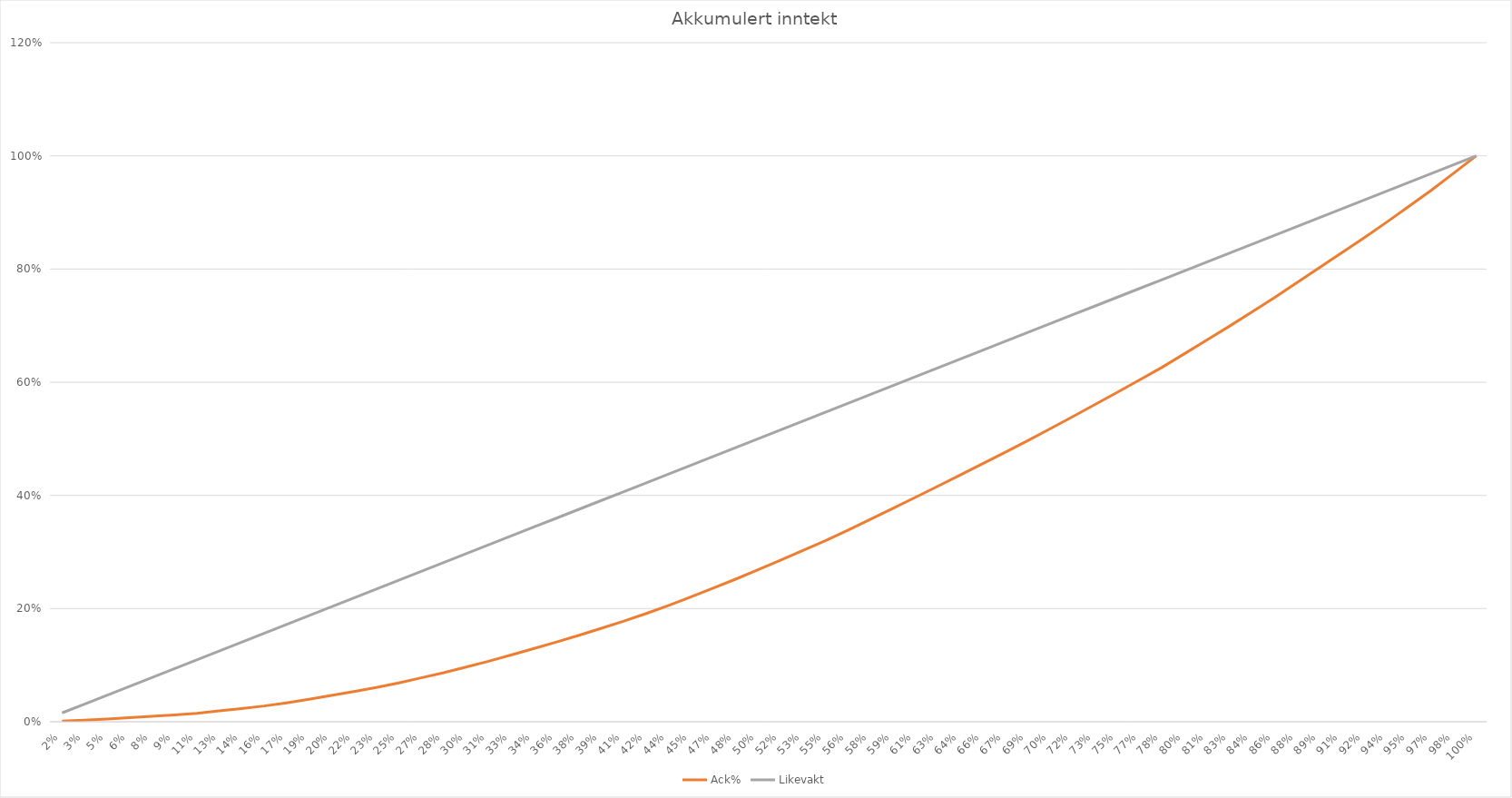
| Category | Ack% | Likevakt |
|---|---|---|
| 0.015625 | 0.001 | 0.016 |
| 0.03125 | 0.003 | 0.031 |
| 0.046875 | 0.005 | 0.047 |
| 0.0625 | 0.007 | 0.062 |
| 0.078125 | 0.01 | 0.078 |
| 0.09375 | 0.012 | 0.094 |
| 0.109375 | 0.015 | 0.109 |
| 0.125 | 0.019 | 0.125 |
| 0.140625 | 0.023 | 0.141 |
| 0.15625 | 0.028 | 0.156 |
| 0.171875 | 0.033 | 0.172 |
| 0.1875 | 0.04 | 0.188 |
| 0.203125 | 0.046 | 0.203 |
| 0.21875 | 0.053 | 0.219 |
| 0.234375 | 0.06 | 0.234 |
| 0.25 | 0.069 | 0.25 |
| 0.265625 | 0.078 | 0.266 |
| 0.28125 | 0.087 | 0.281 |
| 0.296875 | 0.097 | 0.297 |
| 0.3125 | 0.107 | 0.312 |
| 0.328125 | 0.118 | 0.328 |
| 0.34375 | 0.129 | 0.344 |
| 0.359375 | 0.141 | 0.359 |
| 0.375 | 0.153 | 0.375 |
| 0.390625 | 0.165 | 0.391 |
| 0.40625 | 0.177 | 0.406 |
| 0.421875 | 0.191 | 0.422 |
| 0.4375 | 0.205 | 0.438 |
| 0.453125 | 0.22 | 0.453 |
| 0.46875 | 0.236 | 0.469 |
| 0.484375 | 0.252 | 0.484 |
| 0.5 | 0.268 | 0.5 |
| 0.515625 | 0.285 | 0.516 |
| 0.53125 | 0.303 | 0.531 |
| 0.546875 | 0.32 | 0.547 |
| 0.5625 | 0.338 | 0.562 |
| 0.578125 | 0.357 | 0.578 |
| 0.59375 | 0.377 | 0.594 |
| 0.609375 | 0.396 | 0.609 |
| 0.625 | 0.416 | 0.625 |
| 0.640625 | 0.436 | 0.641 |
| 0.65625 | 0.456 | 0.656 |
| 0.671875 | 0.476 | 0.672 |
| 0.6875 | 0.496 | 0.688 |
| 0.703125 | 0.517 | 0.703 |
| 0.71875 | 0.539 | 0.719 |
| 0.734375 | 0.56 | 0.734 |
| 0.75 | 0.582 | 0.75 |
| 0.765625 | 0.604 | 0.766 |
| 0.78125 | 0.626 | 0.781 |
| 0.796875 | 0.65 | 0.797 |
| 0.8125 | 0.675 | 0.812 |
| 0.828125 | 0.699 | 0.828 |
| 0.84375 | 0.724 | 0.844 |
| 0.859375 | 0.749 | 0.859 |
| 0.875 | 0.776 | 0.875 |
| 0.890625 | 0.802 | 0.891 |
| 0.90625 | 0.829 | 0.906 |
| 0.921875 | 0.855 | 0.922 |
| 0.9375 | 0.883 | 0.938 |
| 0.953125 | 0.911 | 0.953 |
| 0.96875 | 0.939 | 0.969 |
| 0.984375 | 0.97 | 0.984 |
| 1.0 | 1 | 1 |